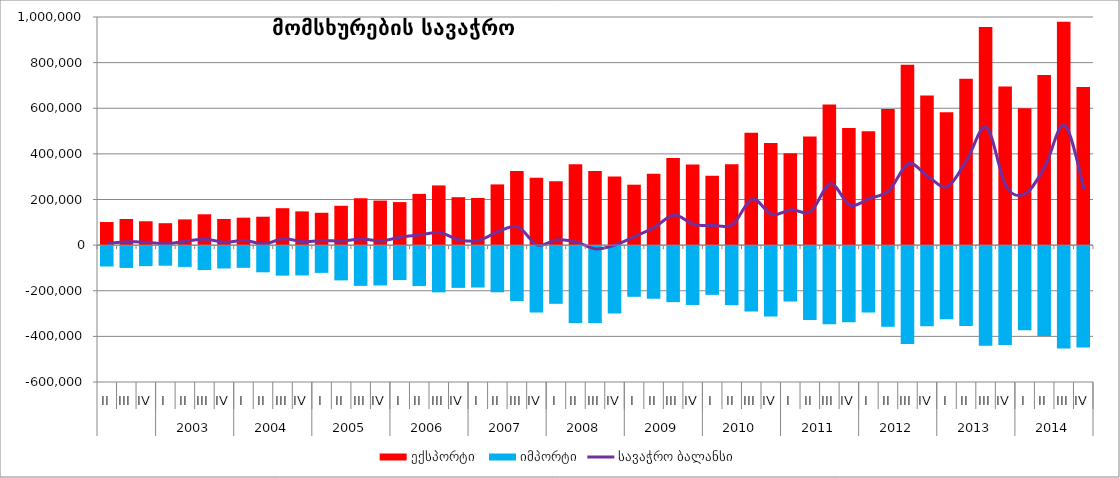
| Category | ექსპორტი  | იმპორტი |
|---|---|---|
| 0 | 101220.277 | -93695.669 |
| 1 | 114616.146 | -99960.516 |
| 2 | 104597.813 | -92133.304 |
| 3 | 96102.058 | -90163.02 |
| 4 | 112856.386 | -95466.043 |
| 5 | 135185.679 | -109319.148 |
| 6 | 114698.91 | -102348.057 |
| 7 | 120397.632 | -99521.723 |
| 8 | 124571.061 | -119128.313 |
| 9 | 161882.13 | -133811.734 |
| 10 | 147911.21 | -132982.475 |
| 11 | 141811.627 | -121639.212 |
| 12 | 172456.658 | -154479.35 |
| 13 | 205506.874 | -178572.717 |
| 14 | 195268.245 | -176761.13 |
| 15 | 188632.643 | -153281.134 |
| 16 | 224575.681 | -179624.294 |
| 17 | 261753.908 | -206957.896 |
| 18 | 210123.58 | -187398.611 |
| 19 | 206876.453 | -185862.119 |
| 20 | 266162.034 | -206602.171 |
| 21 | 325432.039 | -245424.789 |
| 22 | 295638.902 | -295030.919 |
| 23 | 280196.682 | -257248.178 |
| 24 | 354066.036 | -340846.499 |
| 25 | 324889.482 | -341447.222 |
| 26 | 301301.793 | -299882.459 |
| 27 | 264903.998 | -226561.536 |
| 28 | 313311.481 | -235037.426 |
| 29 | 382383.207 | -249991.263 |
| 30 | 353010.364 | -262293.067 |
| 31 | 304483.789 | -217879.02 |
| 32 | 354263.8 | -263232.936 |
| 33 | 492599.694 | -290888.678 |
| 34 | 447423.972 | -313316.693 |
| 35 | 402433.78 | -247232.2 |
| 36 | 475906.544 | -328431.291 |
| 37 | 616171.319 | -347095.2 |
| 38 | 513645.707 | -337933.603 |
| 39 | 499607.449 | -295085.361 |
| 40 | 596895.347 | -358072.392 |
| 41 | 791093.658 | -433796.826 |
| 42 | 656411.742 | -355854.896 |
| 43 | 582176.614 | -325310.604 |
| 44 | 729496.889 | -354020.424 |
| 45 | 956513.447 | -441031.269 |
| 46 | 695845.992 | -438198.975 |
| 47 | 600058.442 | -373270.803 |
| 48 | 746020.585 | -398426.496 |
| 49 | 979704.904 | -453243.043 |
| 50 | 692955.769 | -448962.402 |